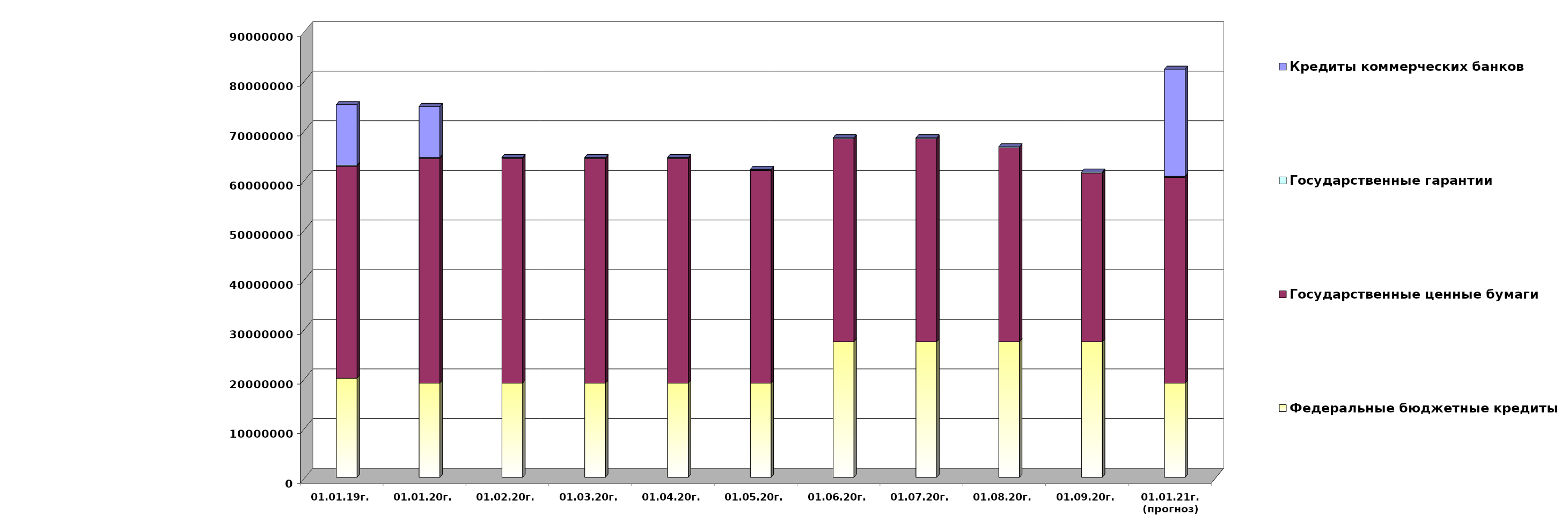
| Category | Федеральные бюджетные кредиты | Государственные ценные бумаги  | Государственные гарантии | Кредиты коммерческих банков |
|---|---|---|---|---|
| 01.01.19г. | 19957026.213 | 42700000 | 209872.86 | 12219963.75 |
| 01.01.20г. | 18954967.463 | 45300000 | 186330.02 | 10291177 |
| 01.02.20г. | 18954967.463 | 45300000 | 184738.25 | 0 |
| 01.03.20г. | 18954967.463 | 45300000 | 184738.25 | 0 |
| 01.04.20г. | 18954967.463 | 45300000 | 184738.25 | 0 |
| 01.05.20г. | 18954967.463 | 42900000 | 184738.25 | 0 |
| 01.06.20г. | 27303300.463 | 40900000 | 184738.25 | 0 |
| 01.07.20г. | 27303300.463 | 40900000 | 184738.25 | 0 |
| 01.08.20г. | 27303300.463 | 39100000 | 184738.25 | 0 |
| 01.09.20г. | 27303300.463 | 34000000 | 184738.25 | 0 |
| 01.01.21г.
(прогноз) | 18954967.5 | 41500000 | 184738.2 | 21581560.2 |